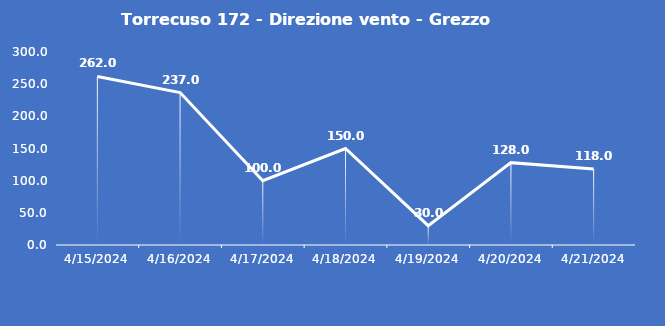
| Category | Torrecuso 172 - Direzione vento - Grezzo (°N) |
|---|---|
| 4/15/24 | 262 |
| 4/16/24 | 237 |
| 4/17/24 | 100 |
| 4/18/24 | 150 |
| 4/19/24 | 30 |
| 4/20/24 | 128 |
| 4/21/24 | 118 |